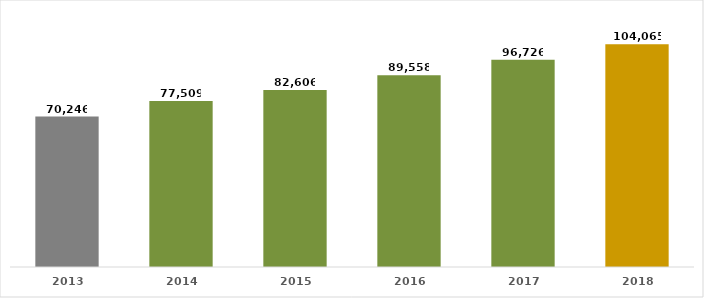
| Category | Series 0 |
|---|---|
| 2013.0 | 70246 |
| 2014.0 | 77509 |
| 2015.0 | 82606 |
| 2016.0 | 89558 |
| 2017.0 | 96726 |
| 2018.0 | 104065 |